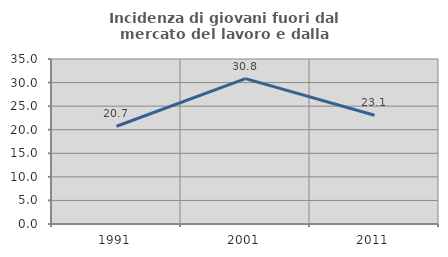
| Category | Incidenza di giovani fuori dal mercato del lavoro e dalla formazione  |
|---|---|
| 1991.0 | 20.737 |
| 2001.0 | 30.827 |
| 2011.0 | 23.077 |